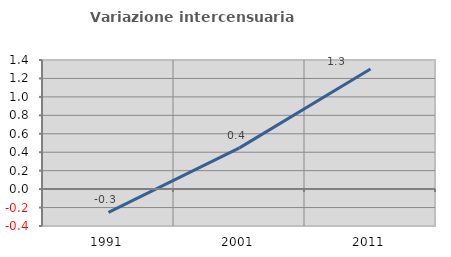
| Category | Variazione intercensuaria annua |
|---|---|
| 1991.0 | -0.253 |
| 2001.0 | 0.447 |
| 2011.0 | 1.303 |